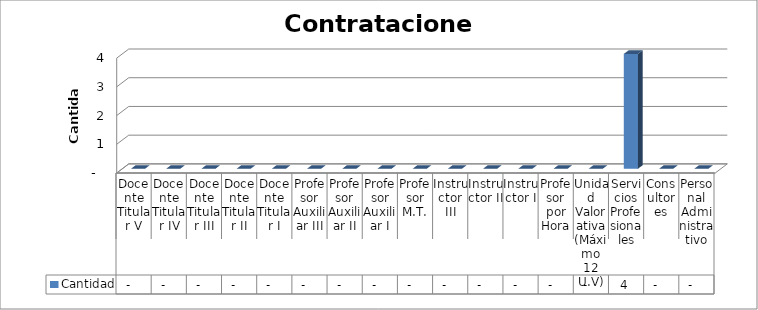
| Category | Cantidad |
|---|---|
| Docente Titular V | 0 |
| Docente Titular IV | 0 |
| Docente Titular III | 0 |
| Docente Titular II | 0 |
| Docente Titular I | 0 |
| Profesor Auxiliar III | 0 |
| Profesor Auxiliar II | 0 |
| Profesor Auxiliar I | 0 |
| Profesor M.T. | 0 |
| Instructor III | 0 |
| Instructor II | 0 |
| Instructor I | 0 |
| Profesor por Hora | 0 |
| Unidad Valorativa (Máximo 12 U.V) | 0 |
| Servicios Profesionales | 4 |
| Consultores | 0 |
| Personal Administrativo | 0 |